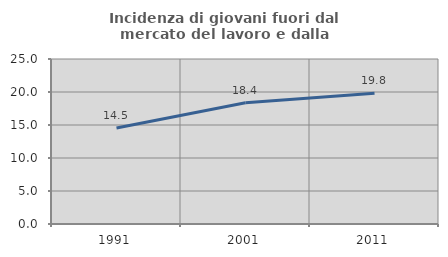
| Category | Incidenza di giovani fuori dal mercato del lavoro e dalla formazione  |
|---|---|
| 1991.0 | 14.546 |
| 2001.0 | 18.363 |
| 2011.0 | 19.823 |